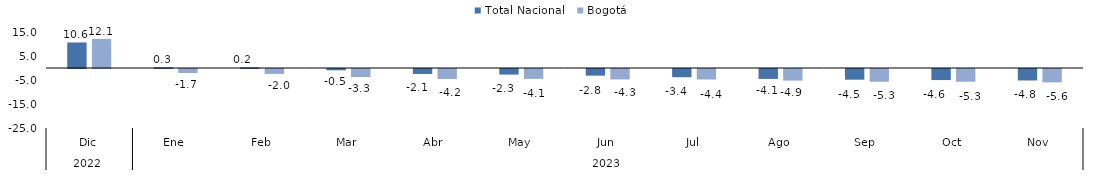
| Category | Total Nacional | Bogotá |
|---|---|---|
| 0 | 10.643 | 12.128 |
| 1 | 0.259 | -1.667 |
| 2 | 0.234 | -2.043 |
| 3 | -0.548 | -3.32 |
| 4 | -2.053 | -4.182 |
| 5 | -2.318 | -4.103 |
| 6 | -2.763 | -4.343 |
| 7 | -3.427 | -4.385 |
| 8 | -4.125 | -4.853 |
| 9 | -4.456 | -5.292 |
| 10 | -4.611 | -5.294 |
| 11 | -4.776 | -5.569 |